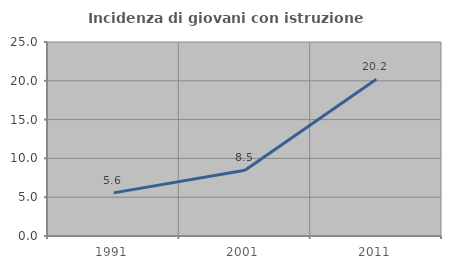
| Category | Incidenza di giovani con istruzione universitaria |
|---|---|
| 1991.0 | 5.556 |
| 2001.0 | 8.466 |
| 2011.0 | 20.192 |